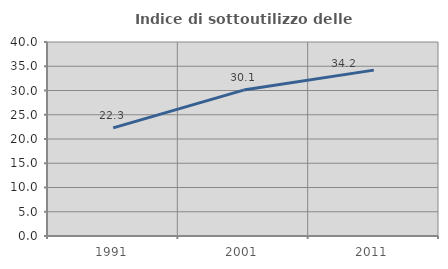
| Category | Indice di sottoutilizzo delle abitazioni  |
|---|---|
| 1991.0 | 22.287 |
| 2001.0 | 30.086 |
| 2011.0 | 34.198 |